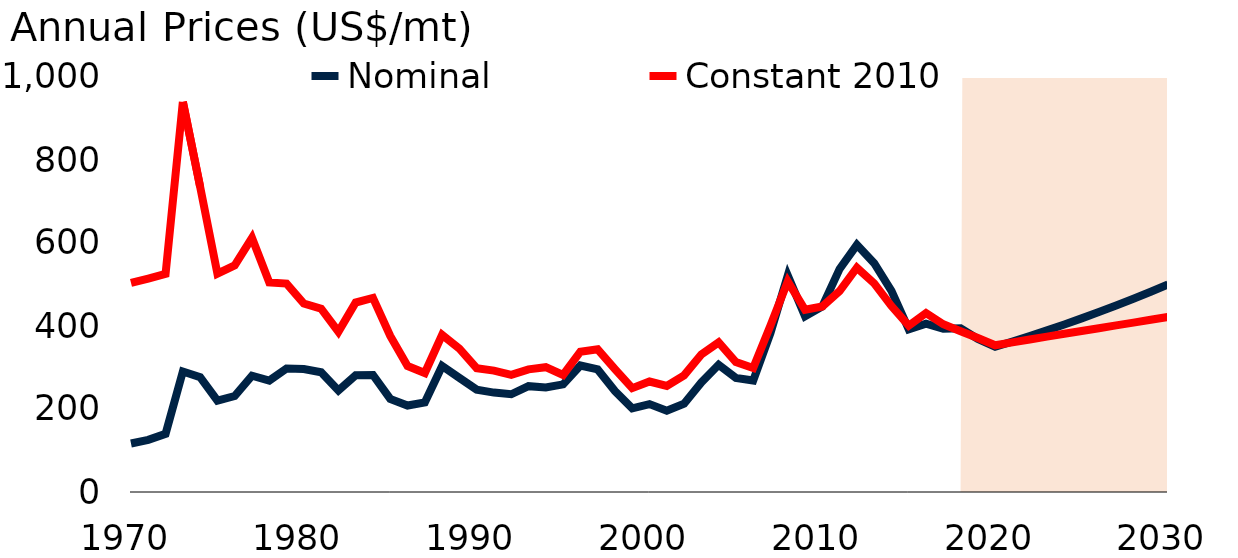
| Category | Nominal | Constant 2010 |
|---|---|---|
| 1970.0 | 116.917 | 503.634 |
| 1971.0 | 125.583 | 514.377 |
| 1972.0 | 140 | 525.67 |
| 1973.0 | 290.333 | 939.998 |
| 1974.0 | 276.917 | 735.699 |
| 1975.0 | 219.917 | 526.081 |
| 1976.0 | 231.167 | 546.287 |
| 1977.0 | 280.167 | 612.489 |
| 1978.0 | 268.333 | 504.787 |
| 1979.0 | 297.75 | 502.12 |
| 1980.0 | 296.229 | 454.17 |
| 1981.0 | 288.417 | 441.687 |
| 1982.0 | 244.604 | 386.091 |
| 1983.0 | 281.588 | 456.575 |
| 1984.0 | 282.083 | 467.671 |
| 1985.0 | 224.417 | 375.985 |
| 1986.0 | 208.417 | 303.59 |
| 1987.0 | 215.75 | 286.786 |
| 1988.0 | 303.5 | 378.839 |
| 1989.0 | 275 | 345.334 |
| 1990.0 | 246.75 | 298.467 |
| 1991.0 | 239.583 | 292.488 |
| 1992.0 | 235.5 | 282.228 |
| 1993.0 | 255.083 | 295.5 |
| 1994.0 | 251.833 | 300.769 |
| 1995.0 | 259.25 | 282.039 |
| 1996.0 | 304.833 | 338.07 |
| 1997.0 | 295.417 | 343.819 |
| 1998.0 | 243.25 | 296.029 |
| 1999.0 | 201.667 | 250.234 |
| 2000.0 | 211.833 | 266.257 |
| 2001.0 | 195.833 | 255.734 |
| 2002.0 | 212.667 | 280.997 |
| 2003.0 | 264 | 331.583 |
| 2004.0 | 306.5 | 360.478 |
| 2005.0 | 274.688 | 313.197 |
| 2006.0 | 268.646 | 298.74 |
| 2007.0 | 383.103 | 401.451 |
| 2008.0 | 521.87 | 507.488 |
| 2009.0 | 423.622 | 439.159 |
| 2010.0 | 447.102 | 447.102 |
| 2011.0 | 537.519 | 484.27 |
| 2012.0 | 595.508 | 540.51 |
| 2013.0 | 551.389 | 502.659 |
| 2014.0 | 484.858 | 448.04 |
| 2015.0 | 392.122 | 400.706 |
| 2016.0 | 405.448 | 431.173 |
| 2017.0 | 393.378 | 404.206 |
| 2018.0 | 394.424 | 387.527 |
| 2019.0 | 368.947 | 370.883 |
| 2020.0 | 350 | 353.573 |
| 2021.0 | 362.709 | 360.65 |
| 2022.0 | 375.879 | 367.586 |
| 2023.0 | 389.528 | 374.437 |
| 2024.0 | 403.672 | 381.236 |
| 2025.0 | 418.33 | 388.003 |
| 2026.0 | 433.52 | 394.753 |
| 2027.0 | 449.262 | 401.496 |
| 2028.0 | 465.575 | 408.237 |
| 2029.0 | 482.481 | 414.98 |
| 2030.0 | 500 | 421.728 |